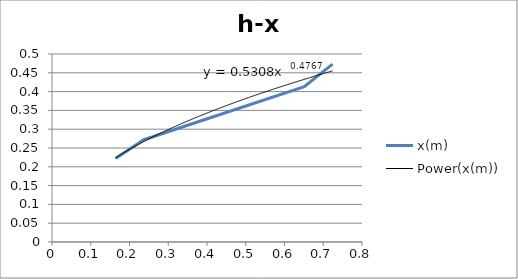
| Category | x(m) |
|---|---|
| 0.164 | 0.222 |
| 0.237 | 0.272 |
| 0.651 | 0.413 |
| 0.724 | 0.473 |